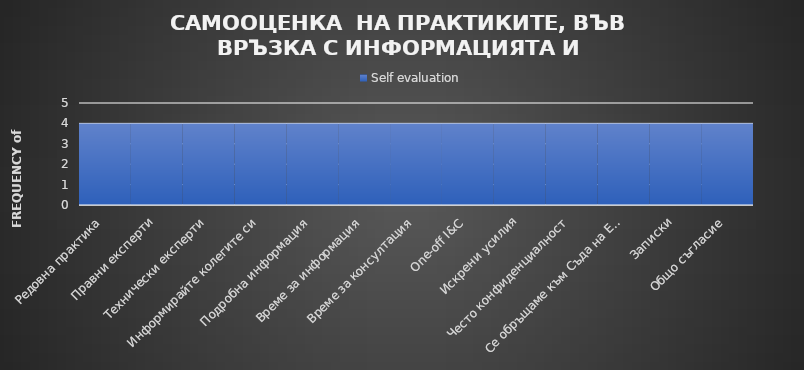
| Category | Self evaluation |
|---|---|
| Редовна практика | 4 |
| Правни експерти | 4 |
| Технически експерти | 4 |
| Информирайте колегите си | 4 |
| Подробна информация | 4 |
| Време за информация | 4 |
| Време за консултация | 4 |
| One-off I&C | 4 |
| Искрени усилия | 4 |
| Често конфиденциалност | 4 |
| Се обръщаме към Съда на Европейските общности. | 4 |
| Записки | 4 |
| Общо съгласие | 4 |